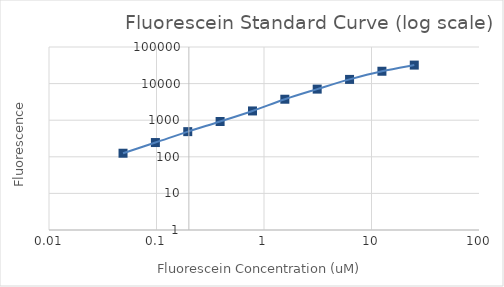
| Category | Series 1 |
|---|---|
| 25.0 | 32045.057 |
| 12.5 | 21760.04 |
| 6.25 | 13021.54 |
| 3.125 | 7068.369 |
| 1.5625 | 3740.876 |
| 0.78125 | 1790.033 |
| 0.390625 | 922.092 |
| 0.1953125 | 486.876 |
| 0.09765625 | 245.324 |
| 0.048828125 | 125.169 |